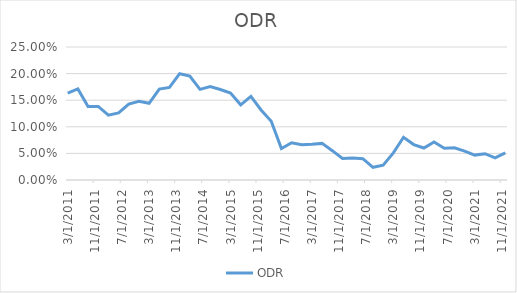
| Category | ODR |
|---|---|
| 3/31/11 | 0.163 |
| 6/30/11 | 0.171 |
| 9/30/11 | 0.138 |
| 12/31/11 | 0.138 |
| 3/31/12 | 0.122 |
| 6/30/12 | 0.126 |
| 9/30/12 | 0.143 |
| 12/31/12 | 0.148 |
| 3/31/13 | 0.144 |
| 6/30/13 | 0.171 |
| 9/30/13 | 0.174 |
| 12/31/13 | 0.2 |
| 3/31/14 | 0.195 |
| 6/30/14 | 0.17 |
| 9/30/14 | 0.175 |
| 12/31/14 | 0.17 |
| 3/31/15 | 0.164 |
| 6/30/15 | 0.141 |
| 9/30/15 | 0.157 |
| 12/31/15 | 0.132 |
| 3/31/16 | 0.111 |
| 6/30/16 | 0.059 |
| 9/30/16 | 0.07 |
| 12/31/16 | 0.066 |
| 3/31/17 | 0.067 |
| 6/30/17 | 0.069 |
| 9/30/17 | 0.055 |
| 12/31/17 | 0.04 |
| 3/31/18 | 0.041 |
| 6/30/18 | 0.04 |
| 9/30/18 | 0.024 |
| 12/31/18 | 0.028 |
| 3/31/19 | 0.051 |
| 6/30/19 | 0.08 |
| 9/30/19 | 0.067 |
| 12/31/19 | 0.06 |
| 3/31/20 | 0.071 |
| 6/30/20 | 0.06 |
| 9/30/20 | 0.061 |
| 12/31/20 | 0.054 |
| 3/31/21 | 0.047 |
| 6/30/21 | 0.049 |
| 9/30/21 | 0.042 |
| 12/31/21 | 0.051 |